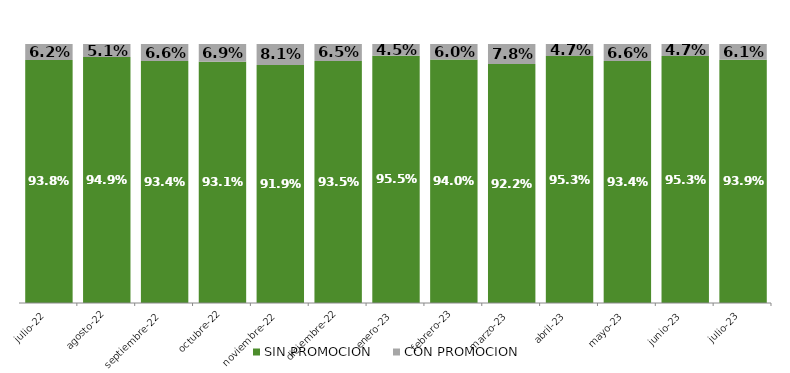
| Category | SIN PROMOCION   | CON PROMOCION   |
|---|---|---|
| 2022-07-01 | 0.938 | 0.062 |
| 2022-08-01 | 0.949 | 0.051 |
| 2022-09-01 | 0.934 | 0.066 |
| 2022-10-01 | 0.931 | 0.069 |
| 2022-11-01 | 0.919 | 0.081 |
| 2022-12-01 | 0.935 | 0.065 |
| 2023-01-01 | 0.955 | 0.045 |
| 2023-02-01 | 0.94 | 0.06 |
| 2023-03-01 | 0.922 | 0.078 |
| 2023-04-01 | 0.953 | 0.047 |
| 2023-05-01 | 0.934 | 0.066 |
| 2023-06-01 | 0.953 | 0.047 |
| 2023-07-01 | 0.939 | 0.061 |